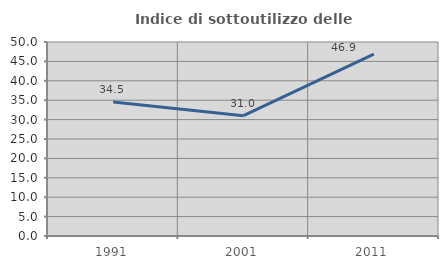
| Category | Indice di sottoutilizzo delle abitazioni  |
|---|---|
| 1991.0 | 34.524 |
| 2001.0 | 31.013 |
| 2011.0 | 46.893 |